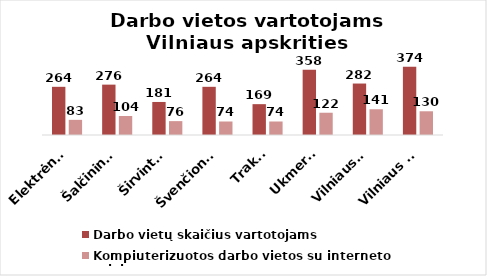
| Category | Darbo vietų skaičius vartotojams | Kompiuterizuotos darbo vietos su interneto prieiga |
|---|---|---|
| Elektrėnai | 264 | 83 |
| Šalčininkai | 276 | 104 |
| Širvintos | 181 | 76 |
| Švenčionys | 264 | 74 |
| Trakai | 169 | 74 |
| Ukmergė | 358 | 122 |
| Vilniaus r. | 282 | 141 |
| Vilniaus m. | 374 | 130 |